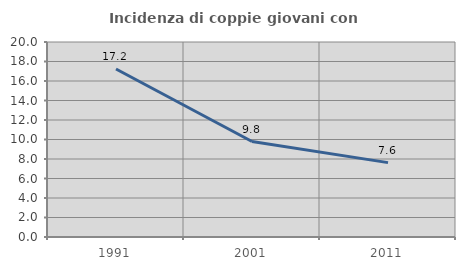
| Category | Incidenza di coppie giovani con figli |
|---|---|
| 1991.0 | 17.232 |
| 2001.0 | 9.79 |
| 2011.0 | 7.627 |